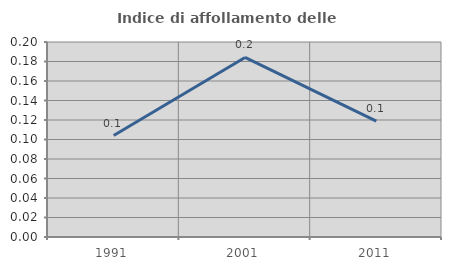
| Category | Indice di affollamento delle abitazioni  |
|---|---|
| 1991.0 | 0.104 |
| 2001.0 | 0.184 |
| 2011.0 | 0.119 |